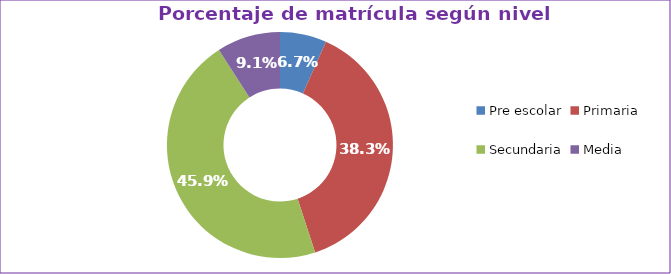
| Category | Series 0 |
|---|---|
| Pre escolar | 0.067 |
| Primaria | 0.383 |
| Secundaria | 0.459 |
| Media | 0.091 |